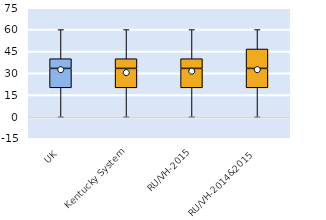
| Category | 25th | 50th | 75th |
|---|---|---|---|
| UK | 20 | 13.333 | 6.667 |
| Kentucky System | 20 | 13.333 | 6.667 |
| RU/VH-2015 | 20 | 13.333 | 6.667 |
| RU/VH-2014&2015 | 20 | 13.333 | 13.333 |